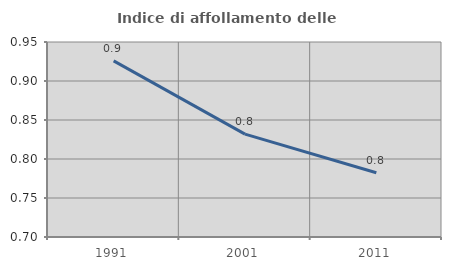
| Category | Indice di affollamento delle abitazioni  |
|---|---|
| 1991.0 | 0.926 |
| 2001.0 | 0.832 |
| 2011.0 | 0.782 |